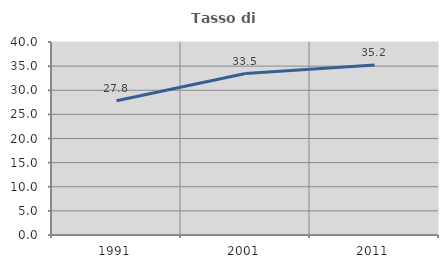
| Category | Tasso di occupazione   |
|---|---|
| 1991.0 | 27.839 |
| 2001.0 | 33.453 |
| 2011.0 | 35.233 |